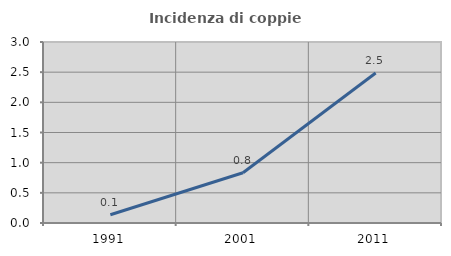
| Category | Incidenza di coppie miste |
|---|---|
| 1991.0 | 0.137 |
| 2001.0 | 0.833 |
| 2011.0 | 2.485 |